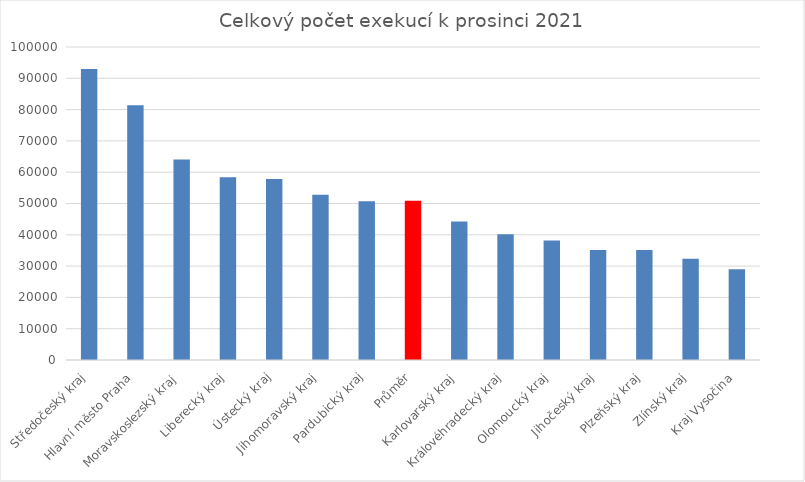
| Category | Celkový počet exekucí k procinci 2021 |
|---|---|
| Středočeský kraj | 92992 |
| Hlavní město Praha | 81401 |
| Moravskoslezský kraj | 64083 |
| Liberecký kraj | 58383 |
| Ústecký kraj | 57798 |
| Jihomoravský kraj | 52815 |
| Pardubický kraj | 50747 |
| Průměr | 50906 |
| Karlovarský kraj | 44231 |
| Královéhradecký kraj | 40162 |
| Olomoucký kraj | 38211 |
| Jihočeský kraj | 35122 |
| Plzeňský kraj | 35180 |
| Zlínský kraj | 32374 |
| Kraj Vysočina | 28988 |